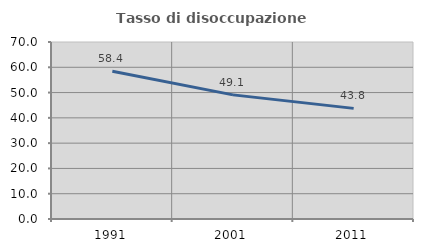
| Category | Tasso di disoccupazione giovanile  |
|---|---|
| 1991.0 | 58.442 |
| 2001.0 | 49.091 |
| 2011.0 | 43.75 |